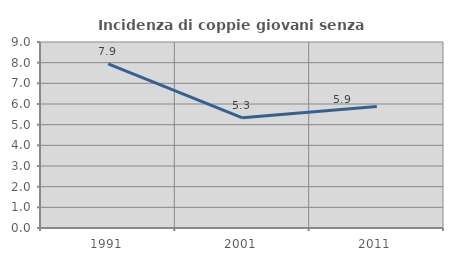
| Category | Incidenza di coppie giovani senza figli |
|---|---|
| 1991.0 | 7.944 |
| 2001.0 | 5.333 |
| 2011.0 | 5.882 |